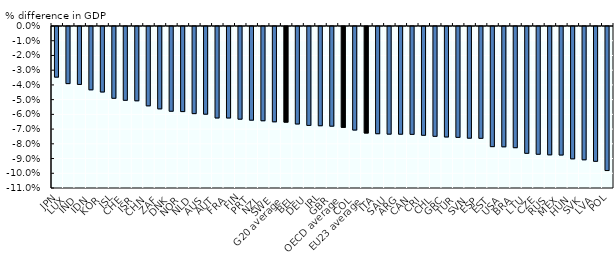
| Category | Series 0 |
|---|---|
| JPN | -0.034 |
| LUX | -0.039 |
| IND | -0.039 |
| IDN | -0.043 |
| KOR | -0.044 |
| ISL | -0.049 |
| CHE | -0.05 |
| ISR | -0.05 |
| CHN | -0.054 |
| ZAF | -0.056 |
| DNK | -0.058 |
| NOR | -0.058 |
| NLD | -0.059 |
| AUS | -0.06 |
| AUT | -0.062 |
| FRA | -0.062 |
| FIN | -0.063 |
| PRT | -0.064 |
| NZL | -0.064 |
| SWE | -0.065 |
| G20 average | -0.065 |
| BEL | -0.066 |
| DEU | -0.067 |
| IRL | -0.067 |
| GBR | -0.068 |
| OECD average | -0.068 |
| COL | -0.07 |
| EU23 average | -0.072 |
| ITA | -0.073 |
| SAU | -0.073 |
| ARG | -0.073 |
| CAN | -0.073 |
| CRI | -0.074 |
| CHL | -0.075 |
| GRC | -0.075 |
| TUR | -0.075 |
| SVN | -0.076 |
| ESP | -0.076 |
| EST | -0.082 |
| USA | -0.082 |
| BRA | -0.082 |
| LTU | -0.086 |
| CZE | -0.087 |
| RUS | -0.087 |
| MEX | -0.087 |
| HUN | -0.09 |
| SVK | -0.091 |
| LVA | -0.092 |
| POL | -0.098 |